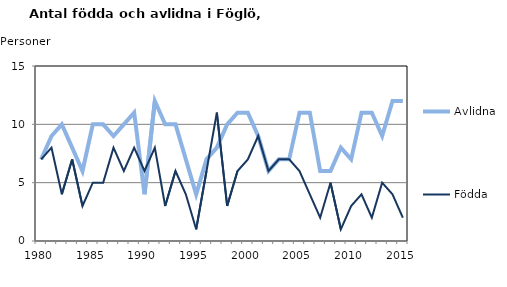
| Category | Avlidna | Födda |
|---|---|---|
| 1980.0 | 7 | 7 |
| 1981.0 | 9 | 8 |
| 1982.0 | 10 | 4 |
| 1983.0 | 8 | 7 |
| 1984.0 | 6 | 3 |
| 1985.0 | 10 | 5 |
| 1986.0 | 10 | 5 |
| 1987.0 | 9 | 8 |
| 1988.0 | 10 | 6 |
| 1989.0 | 11 | 8 |
| 1990.0 | 4 | 6 |
| 1991.0 | 12 | 8 |
| 1992.0 | 10 | 3 |
| 1993.0 | 10 | 6 |
| 1994.0 | 7 | 4 |
| 1995.0 | 4 | 1 |
| 1996.0 | 7 | 6 |
| 1997.0 | 8 | 11 |
| 1998.0 | 10 | 3 |
| 1999.0 | 11 | 6 |
| 2000.0 | 11 | 7 |
| 2001.0 | 9 | 9 |
| 2002.0 | 6 | 6 |
| 2003.0 | 7 | 7 |
| 2004.0 | 7 | 7 |
| 2005.0 | 11 | 6 |
| 2006.0 | 11 | 4 |
| 2007.0 | 6 | 2 |
| 2008.0 | 6 | 5 |
| 2009.0 | 8 | 1 |
| 2010.0 | 7 | 3 |
| 2011.0 | 11 | 4 |
| 2012.0 | 11 | 2 |
| 2013.0 | 9 | 5 |
| 2014.0 | 12 | 4 |
| 2015.0 | 12 | 2 |